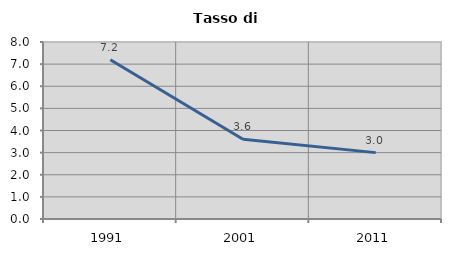
| Category | Tasso di disoccupazione   |
|---|---|
| 1991.0 | 7.194 |
| 2001.0 | 3.604 |
| 2011.0 | 3 |